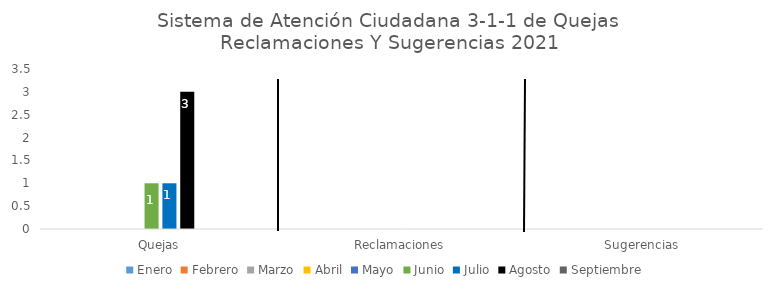
| Category | Enero | Febrero | Marzo | Abril | Mayo | Junio | Julio | Agosto | Septiembre | Octubre | Noviembre | Diciembre |
|---|---|---|---|---|---|---|---|---|---|---|---|---|
| Quejas | 0 | 0 | 0 | 0 | 0 | 1 | 1 | 3 | 0 | 0 | 0 | 0 |
| Reclamaciones | 0 | 0 | 0 | 0 | 0 | 0 | 0 | 0 | 0 | 0 | 0 | 0 |
| Sugerencias | 0 | 0 | 0 | 0 | 0 | 0 | 0 | 0 | 0 | 0 | 0 | 0 |